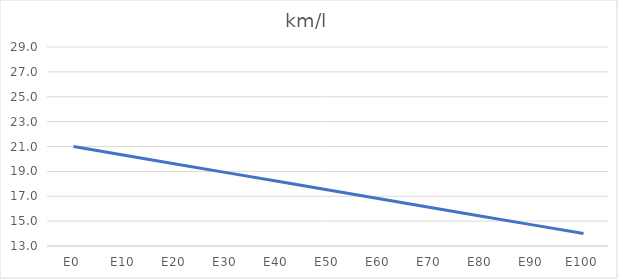
| Category | km/l |
|---|---|
| E0 | 21 |
| E10 | 20.3 |
| E20 | 19.6 |
| E30 | 18.9 |
| E40 | 18.2 |
| E50 | 17.5 |
| E60 | 16.8 |
| E70 | 16.1 |
| E80 | 15.4 |
| E90 | 14.7 |
| E100 | 14 |